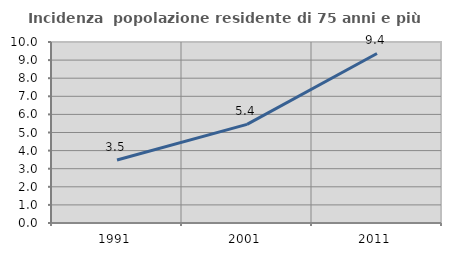
| Category | Incidenza  popolazione residente di 75 anni e più |
|---|---|
| 1991.0 | 3.478 |
| 2001.0 | 5.447 |
| 2011.0 | 9.367 |